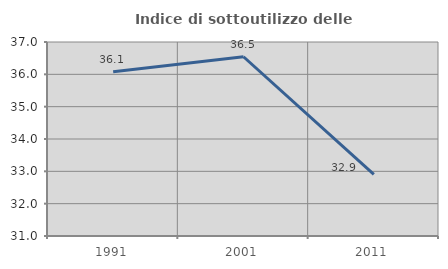
| Category | Indice di sottoutilizzo delle abitazioni  |
|---|---|
| 1991.0 | 36.082 |
| 2001.0 | 36.544 |
| 2011.0 | 32.909 |